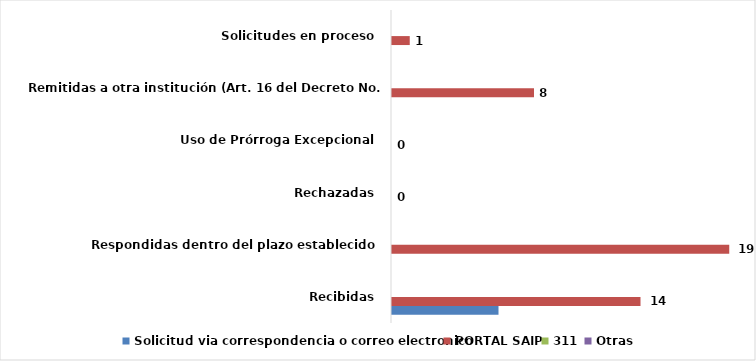
| Category | Solicitud via correspondencia o correo electronico | PORTAL SAIP | 311 | Otras |
|---|---|---|---|---|
| Recibidas  | 6 | 14 | 0 | 0 |
| Respondidas dentro del plazo establecido  | 0 | 19 | 0 | 0 |
| Rechazadas  | 0 | 0 | 0 | 0 |
| Uso de Prórroga Excepcional  | 0 | 0 | 0 | 0 |
| Remitidas a otra institución (Art. 16 del Decreto No. 130-05)  | 0 | 8 | 0 | 0 |
| Solicitudes en proceso  | 0 | 1 | 0 | 0 |